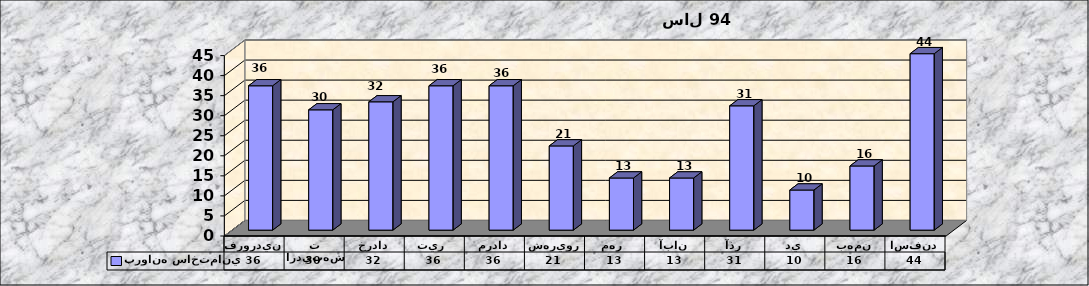
| Category | پروانه ساختماني |
|---|---|
| فروردين | 36 |
| ارديبهشت | 30 |
| خرداد | 32 |
| تير  | 36 |
| مرداد | 36 |
| شهريور | 21 |
| مهر  | 13 |
| آبان | 13 |
| آذر | 31 |
| دي | 10 |
| بهمن | 16 |
| اسفند | 44 |